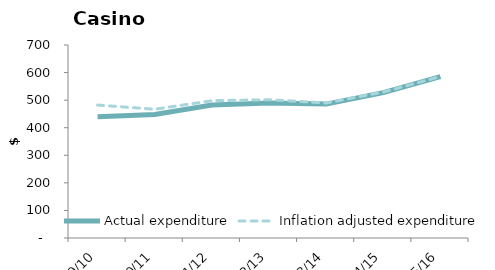
| Category | Actual expenditure | Inflation adjusted expenditure |
|---|---|---|
| 2009/10 | 439.795 | 482.214 |
| 2010/11 | 448.337 | 466.936 |
| 2011/12 | 482.662 | 497.952 |
| 2012/13 | 489.573 | 501.646 |
| 2013/14 | 485.655 | 489.719 |
| 2014/15 | 527.104 | 529.3 |
| 2015/16 | 585.622 | 585.622 |